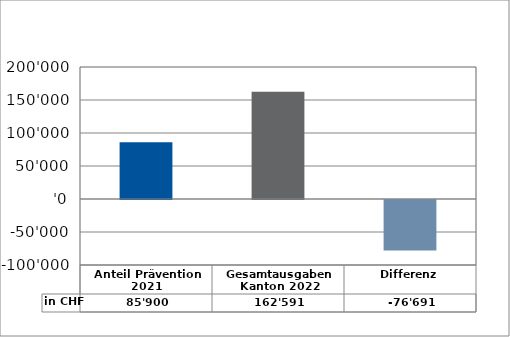
| Category | in CHF |
|---|---|
| Anteil Prävention 2021

 | 85900 |
| Gesamtausgaben Kanton 2022
 | 162591 |
| Differenz | -76691 |